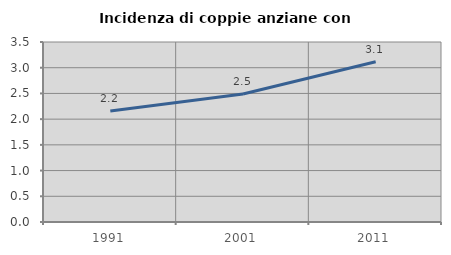
| Category | Incidenza di coppie anziane con figli |
|---|---|
| 1991.0 | 2.158 |
| 2001.0 | 2.49 |
| 2011.0 | 3.115 |